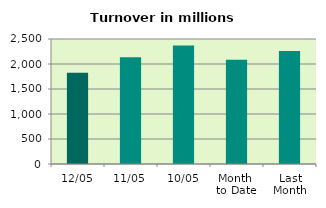
| Category | Series 0 |
|---|---|
| 12/05 | 1824.599 |
| 11/05 | 2134.341 |
| 10/05 | 2368.824 |
| Month 
to Date | 2083.882 |
| Last
Month | 2261.282 |